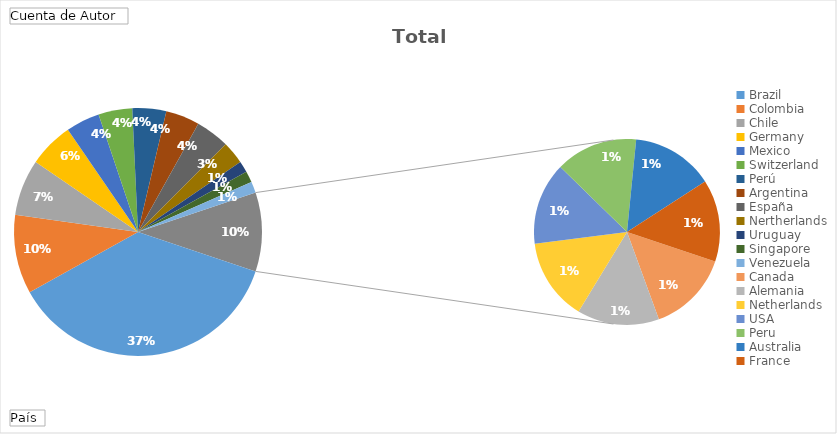
| Category | Total |
|---|---|
| Brazil | 25 |
| Colombia | 7 |
| Chile | 5 |
| Germany | 4 |
| Mexico | 3 |
| Switzerland | 3 |
| Perú | 3 |
| Argentina | 3 |
| España | 3 |
| Nertherlands | 2 |
| Uruguay | 1 |
| Singapore | 1 |
| Venezuela | 1 |
| Canada | 1 |
| Alemania | 1 |
| Netherlands | 1 |
| USA | 1 |
| Peru | 1 |
| Australia | 1 |
| France | 1 |